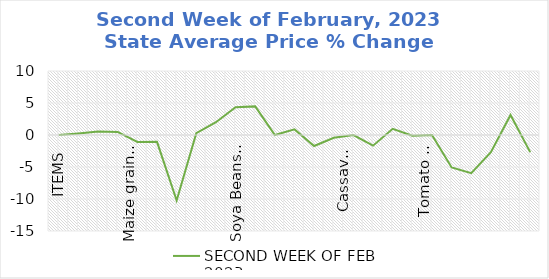
| Category | SECOND WEEK OF FEB 2023 |
|---|---|
| ITEMS | 0 |
| Rice, Imported, High Quality Sold loose  (1 mudu) | 0.242 |
| Rice, Agric Sold Loose(Low quality) imported  (1 mudu) | 0.532 |
| Rice Local, Sold Loose   (1 mudu) | 0.476 |
| Maize grain, white sold loose   (1 mudu) | -1.083 |
| Maize grain, yellow sold loose   (1 mudu) | -1.07 |
| Sorghum (Guinea Corn) white or brown, sold loose   (1 mudu) | -10.231 |
| millet (jero or maiwa) sold loose   (1 mudu) | 0.284 |
| Beans: white black eye. Sold loose   (1 mudu) | 1.993 |
| Beans Brown, sold loose  (1 mudu) | 4.348 |
| Soya Beans, sold loose    (1 mudu) | 4.471 |
| Gari White, sold loose  (1 mudu) | 0 |
| Gari Yellow, sold loose   (1 mudu) | 0.877 |
| Palm oil (1 schnap bottle) | -1.724 |
| Yam tuber (1 Medium Size) | -0.442 |
| Cassava tuber | 0 |
| Irish potato  (4 Litre rubber) | -1.665 |
| Sweet potato  (5 Medium Size) | 0.962 |
| Local live chicken  | -0.102 |
| Groundnut - shelled (fresh) | 0 |
| Tomato fresh   (4 Litre rubber) | -5.078 |
| Okro fresh     (1 mudu) | -5.952 |
| Okro dried    (1 mudu) | -2.692 |
| Onion   (4 Litre rubber) | 3.125 |
| Pepper fresh   (4 Litre rubber) | -2.676 |